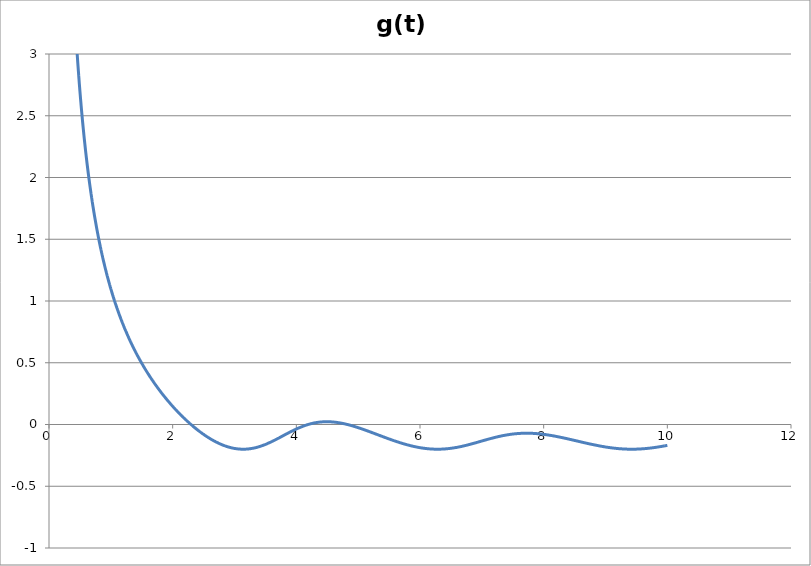
| Category | g(t)  |
|---|---|
| 0.01 | 149.798 |
| 0.02 | 74.796 |
| 0.03 | 49.794 |
| 0.04 | 37.292 |
| 0.05 | 29.79 |
| 0.06 | 24.788 |
| 0.07 | 21.215 |
| 0.08 | 18.534 |
| 0.09 | 16.449 |
| 0.1 | 14.78 |
| 0.11 | 13.414 |
| 0.12 | 12.276 |
| 0.13 | 11.312 |
| 0.14 | 10.486 |
| 0.15 | 9.77 |
| 0.16 | 9.143 |
| 0.17 | 8.59 |
| 0.18 | 8.097 |
| 0.19 | 7.657 |
| 0.2 | 7.26 |
| 0.21 | 6.901 |
| 0.22 | 6.574 |
| 0.23 | 6.276 |
| 0.24 | 6.002 |
| 0.25 | 5.75 |
| 0.26 | 5.517 |
| 0.27 | 5.302 |
| 0.28 | 5.101 |
| 0.29 | 4.914 |
| 0.3 | 4.74 |
| 0.31 | 4.577 |
| 0.32 | 4.423 |
| 0.33 | 4.279 |
| 0.34 | 4.144 |
| 0.35 | 4.016 |
| 0.36 | 3.895 |
| 0.37 | 3.78 |
| 0.38 | 3.671 |
| 0.39 | 3.568 |
| 0.4 | 3.47 |
| 0.41 | 3.376 |
| 0.42 | 3.287 |
| 0.43 | 3.202 |
| 0.44 | 3.121 |
| 0.45 | 3.043 |
| 0.46 | 2.969 |
| 0.47 | 2.897 |
| 0.48 | 2.829 |
| 0.49 | 2.763 |
| 0.5 | 2.7 |
| 0.51 | 2.639 |
| 0.52 | 2.58 |
| 0.53 | 2.524 |
| 0.54 | 2.469 |
| 0.55 | 2.417 |
| 0.56 | 2.366 |
| 0.57 | 2.317 |
| 0.58 | 2.27 |
| 0.59 | 2.224 |
| 0.6 | 2.18 |
| 0.61 | 2.137 |
| 0.62 | 2.095 |
| 0.63 | 2.055 |
| 0.64 | 2.015 |
| 0.65 | 1.977 |
| 0.66 | 1.94 |
| 0.67 | 1.904 |
| 0.68 | 1.869 |
| 0.69 | 1.835 |
| 0.7 | 1.802 |
| 0.71 | 1.77 |
| 0.72 | 1.739 |
| 0.73 | 1.708 |
| 0.74 | 1.678 |
| 0.75 | 1.649 |
| 0.76 | 1.621 |
| 0.77 | 1.593 |
| 0.78 | 1.566 |
| 0.79 | 1.54 |
| 0.8 | 1.514 |
| 0.81 | 1.489 |
| 0.82 | 1.464 |
| 0.83 | 1.44 |
| 0.84 | 1.417 |
| 0.85 | 1.394 |
| 0.86 | 1.371 |
| 0.87 | 1.349 |
| 0.88 | 1.327 |
| 0.89 | 1.306 |
| 0.9 | 1.285 |
| 0.91 | 1.265 |
| 0.92 | 1.245 |
| 0.93 | 1.226 |
| 0.94 | 1.206 |
| 0.95 | 1.188 |
| 0.96 | 1.169 |
| 0.97 | 1.151 |
| 0.98 | 1.133 |
| 0.99 | 1.116 |
| 1.0 | 1.098 |
| 1.01 | 1.081 |
| 1.02 | 1.065 |
| 1.03 | 1.049 |
| 1.04 | 1.033 |
| 1.05 | 1.017 |
| 1.06 | 1.001 |
| 1.07 | 0.986 |
| 1.08 | 0.971 |
| 1.09 | 0.956 |
| 1.1 | 0.942 |
| 1.11 | 0.927 |
| 1.12 | 0.913 |
| 1.13 | 0.899 |
| 1.14 | 0.886 |
| 1.15 | 0.872 |
| 1.16 | 0.859 |
| 1.17 | 0.846 |
| 1.18 | 0.833 |
| 1.19 | 0.82 |
| 1.2 | 0.807 |
| 1.21 | 0.795 |
| 1.22 | 0.783 |
| 1.23 | 0.771 |
| 1.24 | 0.759 |
| 1.25 | 0.747 |
| 1.26 | 0.736 |
| 1.27 | 0.724 |
| 1.28 | 0.713 |
| 1.29 | 0.702 |
| 1.3 | 0.691 |
| 1.31 | 0.68 |
| 1.32 | 0.669 |
| 1.33 | 0.659 |
| 1.34 | 0.648 |
| 1.35 | 0.638 |
| 1.36 | 0.628 |
| 1.37 | 0.618 |
| 1.38 | 0.608 |
| 1.39 | 0.598 |
| 1.4 | 0.588 |
| 1.41 | 0.578 |
| 1.42 | 0.569 |
| 1.43 | 0.559 |
| 1.44 | 0.55 |
| 1.45 | 0.541 |
| 1.46 | 0.532 |
| 1.47 | 0.523 |
| 1.48 | 0.514 |
| 1.49 | 0.505 |
| 1.5 | 0.496 |
| 1.51 | 0.487 |
| 1.52 | 0.479 |
| 1.53 | 0.47 |
| 1.54 | 0.462 |
| 1.55 | 0.454 |
| 1.56 | 0.445 |
| 1.57 | 0.437 |
| 1.58 | 0.429 |
| 1.59 | 0.421 |
| 1.6 | 0.413 |
| 1.61 | 0.405 |
| 1.62 | 0.398 |
| 1.63 | 0.39 |
| 1.64 | 0.382 |
| 1.65 | 0.375 |
| 1.66 | 0.367 |
| 1.67 | 0.36 |
| 1.68 | 0.353 |
| 1.69 | 0.345 |
| 1.7 | 0.338 |
| 1.71 | 0.331 |
| 1.72 | 0.324 |
| 1.73 | 0.317 |
| 1.74 | 0.31 |
| 1.75 | 0.303 |
| 1.76 | 0.296 |
| 1.77 | 0.289 |
| 1.78 | 0.282 |
| 1.79 | 0.276 |
| 1.8 | 0.269 |
| 1.81 | 0.263 |
| 1.82 | 0.256 |
| 1.83 | 0.25 |
| 1.84 | 0.243 |
| 1.85 | 0.237 |
| 1.86 | 0.231 |
| 1.87 | 0.224 |
| 1.88 | 0.218 |
| 1.89 | 0.212 |
| 1.9 | 0.206 |
| 1.91 | 0.2 |
| 1.92 | 0.194 |
| 1.93 | 0.188 |
| 1.94 | 0.182 |
| 1.95 | 0.176 |
| 1.96 | 0.17 |
| 1.97 | 0.165 |
| 1.98 | 0.159 |
| 1.99 | 0.153 |
| 2.0 | 0.148 |
| 2.01 | 0.142 |
| 2.02 | 0.137 |
| 2.03 | 0.131 |
| 2.04 | 0.126 |
| 2.05 | 0.12 |
| 2.06 | 0.115 |
| 2.07 | 0.11 |
| 2.08 | 0.104 |
| 2.09 | 0.099 |
| 2.1 | 0.094 |
| 2.11 | 0.089 |
| 2.12 | 0.084 |
| 2.13 | 0.079 |
| 2.14 | 0.074 |
| 2.15 | 0.069 |
| 2.16 | 0.064 |
| 2.17 | 0.059 |
| 2.18 | 0.054 |
| 2.19 | 0.049 |
| 2.2 | 0.044 |
| 2.21 | 0.04 |
| 2.22 | 0.035 |
| 2.23 | 0.03 |
| 2.24 | 0.026 |
| 2.25 | 0.021 |
| 2.26 | 0.017 |
| 2.27 | 0.012 |
| 2.28 | 0.008 |
| 2.29 | 0.003 |
| 2.3 | -0.001 |
| 2.31 | -0.006 |
| 2.32 | -0.01 |
| 2.33 | -0.014 |
| 2.34 | -0.018 |
| 2.35 | -0.022 |
| 2.36 | -0.027 |
| 2.37 | -0.031 |
| 2.38 | -0.035 |
| 2.39 | -0.039 |
| 2.4 | -0.043 |
| 2.41 | -0.046 |
| 2.42 | -0.05 |
| 2.43 | -0.054 |
| 2.44 | -0.058 |
| 2.45 | -0.062 |
| 2.46 | -0.065 |
| 2.47 | -0.069 |
| 2.48 | -0.073 |
| 2.49 | -0.076 |
| 2.5 | -0.08 |
| 2.51 | -0.083 |
| 2.52 | -0.087 |
| 2.53 | -0.09 |
| 2.54 | -0.093 |
| 2.55 | -0.097 |
| 2.56 | -0.1 |
| 2.57 | -0.103 |
| 2.58 | -0.106 |
| 2.59 | -0.11 |
| 2.6 | -0.113 |
| 2.61 | -0.116 |
| 2.62 | -0.119 |
| 2.63 | -0.122 |
| 2.64 | -0.124 |
| 2.65 | -0.127 |
| 2.66 | -0.13 |
| 2.67 | -0.133 |
| 2.68 | -0.136 |
| 2.69 | -0.138 |
| 2.7 | -0.141 |
| 2.71 | -0.143 |
| 2.72 | -0.146 |
| 2.73 | -0.148 |
| 2.74 | -0.151 |
| 2.75 | -0.153 |
| 2.76 | -0.155 |
| 2.77 | -0.158 |
| 2.78 | -0.16 |
| 2.79 | -0.162 |
| 2.8 | -0.164 |
| 2.81 | -0.166 |
| 2.82 | -0.168 |
| 2.83 | -0.17 |
| 2.84 | -0.172 |
| 2.85 | -0.174 |
| 2.86 | -0.175 |
| 2.87 | -0.177 |
| 2.88 | -0.179 |
| 2.89 | -0.18 |
| 2.9 | -0.182 |
| 2.91 | -0.183 |
| 2.92 | -0.185 |
| 2.93 | -0.186 |
| 2.94 | -0.187 |
| 2.95 | -0.188 |
| 2.96 | -0.19 |
| 2.97 | -0.191 |
| 2.98 | -0.192 |
| 2.99 | -0.193 |
| 3.0 | -0.194 |
| 3.01 | -0.195 |
| 3.02 | -0.195 |
| 3.03 | -0.196 |
| 3.04 | -0.197 |
| 3.05 | -0.197 |
| 3.06 | -0.198 |
| 3.07 | -0.198 |
| 3.08 | -0.199 |
| 3.09 | -0.199 |
| 3.1 | -0.199 |
| 3.11 | -0.2 |
| 3.12 | -0.2 |
| 3.13 | -0.2 |
| 3.14 | -0.2 |
| 3.15 | -0.2 |
| 3.16 | -0.2 |
| 3.17 | -0.2 |
| 3.18 | -0.2 |
| 3.19 | -0.199 |
| 3.2 | -0.199 |
| 3.21 | -0.199 |
| 3.22 | -0.198 |
| 3.23 | -0.198 |
| 3.24 | -0.197 |
| 3.25 | -0.196 |
| 3.26 | -0.196 |
| 3.27 | -0.195 |
| 3.28 | -0.194 |
| 3.29 | -0.193 |
| 3.3 | -0.192 |
| 3.31 | -0.191 |
| 3.32 | -0.19 |
| 3.33 | -0.189 |
| 3.34 | -0.188 |
| 3.35 | -0.186 |
| 3.36 | -0.185 |
| 3.37 | -0.184 |
| 3.38 | -0.182 |
| 3.39 | -0.181 |
| 3.4 | -0.179 |
| 3.41 | -0.178 |
| 3.42 | -0.176 |
| 3.43 | -0.174 |
| 3.44 | -0.173 |
| 3.45 | -0.171 |
| 3.46 | -0.169 |
| 3.47 | -0.167 |
| 3.48 | -0.165 |
| 3.49 | -0.163 |
| 3.5 | -0.161 |
| 3.51 | -0.159 |
| 3.52 | -0.157 |
| 3.53 | -0.155 |
| 3.54 | -0.153 |
| 3.55 | -0.15 |
| 3.56 | -0.148 |
| 3.57 | -0.146 |
| 3.58 | -0.144 |
| 3.59 | -0.141 |
| 3.6 | -0.139 |
| 3.61 | -0.136 |
| 3.62 | -0.134 |
| 3.63 | -0.132 |
| 3.64 | -0.129 |
| 3.65 | -0.127 |
| 3.66 | -0.124 |
| 3.67 | -0.121 |
| 3.68 | -0.119 |
| 3.69 | -0.116 |
| 3.7 | -0.114 |
| 3.71 | -0.111 |
| 3.72 | -0.108 |
| 3.73 | -0.106 |
| 3.74 | -0.103 |
| 3.75 | -0.1 |
| 3.76 | -0.098 |
| 3.77 | -0.095 |
| 3.78 | -0.092 |
| 3.79 | -0.09 |
| 3.8 | -0.087 |
| 3.81 | -0.084 |
| 3.82 | -0.082 |
| 3.83 | -0.079 |
| 3.84 | -0.076 |
| 3.85 | -0.074 |
| 3.86 | -0.071 |
| 3.87 | -0.069 |
| 3.88 | -0.066 |
| 3.89 | -0.063 |
| 3.9 | -0.061 |
| 3.91 | -0.058 |
| 3.92 | -0.056 |
| 3.93 | -0.053 |
| 3.94 | -0.051 |
| 3.95 | -0.048 |
| 3.96 | -0.046 |
| 3.97 | -0.044 |
| 3.98 | -0.041 |
| 3.99 | -0.039 |
| 4.0 | -0.037 |
| 4.01 | -0.034 |
| 4.02 | -0.032 |
| 4.03 | -0.03 |
| 4.04 | -0.028 |
| 4.05 | -0.026 |
| 4.06 | -0.023 |
| 4.07 | -0.021 |
| 4.08 | -0.019 |
| 4.09 | -0.017 |
| 4.1 | -0.016 |
| 4.11 | -0.014 |
| 4.12 | -0.012 |
| 4.13 | -0.01 |
| 4.14 | -0.008 |
| 4.15 | -0.007 |
| 4.16 | -0.005 |
| 4.17 | -0.003 |
| 4.18 | -0.002 |
| 4.19 | 0 |
| 4.2 | 0.001 |
| 4.21 | 0.003 |
| 4.22 | 0.004 |
| 4.23 | 0.005 |
| 4.24 | 0.007 |
| 4.25 | 0.008 |
| 4.26 | 0.009 |
| 4.27 | 0.01 |
| 4.28 | 0.011 |
| 4.29 | 0.012 |
| 4.3 | 0.013 |
| 4.31 | 0.014 |
| 4.32 | 0.015 |
| 4.33 | 0.016 |
| 4.34 | 0.017 |
| 4.35 | 0.018 |
| 4.36 | 0.018 |
| 4.37 | 0.019 |
| 4.38 | 0.019 |
| 4.39 | 0.02 |
| 4.4 | 0.02 |
| 4.41 | 0.021 |
| 4.42 | 0.021 |
| 4.43 | 0.022 |
| 4.44 | 0.022 |
| 4.45 | 0.022 |
| 4.46 | 0.022 |
| 4.47 | 0.022 |
| 4.48 | 0.023 |
| 4.49 | 0.023 |
| 4.5 | 0.023 |
| 4.51 | 0.022 |
| 4.52 | 0.022 |
| 4.53 | 0.022 |
| 4.54 | 0.022 |
| 4.55 | 0.022 |
| 4.56 | 0.022 |
| 4.57 | 0.021 |
| 4.58 | 0.021 |
| 4.59 | 0.02 |
| 4.6 | 0.02 |
| 4.61 | 0.019 |
| 4.62 | 0.019 |
| 4.63 | 0.018 |
| 4.64 | 0.018 |
| 4.65 | 0.017 |
| 4.66 | 0.016 |
| 4.67 | 0.016 |
| 4.68 | 0.015 |
| 4.69 | 0.014 |
| 4.7 | 0.013 |
| 4.71 | 0.012 |
| 4.72 | 0.012 |
| 4.73 | 0.011 |
| 4.74 | 0.01 |
| 4.75 | 0.009 |
| 4.76 | 0.008 |
| 4.77 | 0.006 |
| 4.78 | 0.005 |
| 4.79 | 0.004 |
| 4.8 | 0.003 |
| 4.81 | 0.002 |
| 4.82 | 0.001 |
| 4.83 | -0.001 |
| 4.84 | -0.002 |
| 4.85 | -0.003 |
| 4.86 | -0.005 |
| 4.87 | -0.006 |
| 4.88 | -0.007 |
| 4.89 | -0.009 |
| 4.9 | -0.01 |
| 4.91 | -0.012 |
| 4.92 | -0.013 |
| 4.93 | -0.015 |
| 4.94 | -0.016 |
| 4.95 | -0.018 |
| 4.96 | -0.019 |
| 4.97 | -0.021 |
| 4.98 | -0.022 |
| 4.99 | -0.024 |
| 5.0 | -0.026 |
| 5.01 | -0.027 |
| 5.02 | -0.029 |
| 5.03 | -0.031 |
| 5.04 | -0.032 |
| 5.05 | -0.034 |
| 5.06 | -0.036 |
| 5.07 | -0.037 |
| 5.08 | -0.039 |
| 5.09 | -0.041 |
| 5.1 | -0.043 |
| 5.11 | -0.045 |
| 5.12 | -0.046 |
| 5.13 | -0.048 |
| 5.14 | -0.05 |
| 5.15 | -0.052 |
| 5.16 | -0.054 |
| 5.17 | -0.055 |
| 5.18 | -0.057 |
| 5.19 | -0.059 |
| 5.2 | -0.061 |
| 5.21 | -0.063 |
| 5.22 | -0.065 |
| 5.23 | -0.067 |
| 5.24 | -0.068 |
| 5.25 | -0.07 |
| 5.26 | -0.072 |
| 5.27 | -0.074 |
| 5.28 | -0.076 |
| 5.29 | -0.078 |
| 5.3 | -0.08 |
| 5.31 | -0.082 |
| 5.32 | -0.084 |
| 5.33 | -0.085 |
| 5.34 | -0.087 |
| 5.35 | -0.089 |
| 5.36 | -0.091 |
| 5.37 | -0.093 |
| 5.38 | -0.095 |
| 5.39 | -0.097 |
| 5.4 | -0.099 |
| 5.41 | -0.1 |
| 5.42 | -0.102 |
| 5.43 | -0.104 |
| 5.44 | -0.106 |
| 5.45 | -0.108 |
| 5.46 | -0.11 |
| 5.47 | -0.112 |
| 5.48 | -0.113 |
| 5.49 | -0.115 |
| 5.5 | -0.117 |
| 5.51 | -0.119 |
| 5.52 | -0.121 |
| 5.53 | -0.122 |
| 5.54 | -0.124 |
| 5.55 | -0.126 |
| 5.56 | -0.128 |
| 5.57 | -0.129 |
| 5.58 | -0.131 |
| 5.59 | -0.133 |
| 5.6 | -0.135 |
| 5.61 | -0.136 |
| 5.62 | -0.138 |
| 5.63 | -0.14 |
| 5.64 | -0.141 |
| 5.65 | -0.143 |
| 5.66 | -0.144 |
| 5.67 | -0.146 |
| 5.68 | -0.148 |
| 5.69 | -0.149 |
| 5.7 | -0.151 |
| 5.71 | -0.152 |
| 5.72 | -0.154 |
| 5.73 | -0.155 |
| 5.74 | -0.157 |
| 5.75 | -0.158 |
| 5.76 | -0.16 |
| 5.77 | -0.161 |
| 5.78 | -0.163 |
| 5.79 | -0.164 |
| 5.8 | -0.165 |
| 5.81 | -0.167 |
| 5.82 | -0.168 |
| 5.83 | -0.169 |
| 5.84 | -0.17 |
| 5.85 | -0.172 |
| 5.86 | -0.173 |
| 5.87 | -0.174 |
| 5.88 | -0.175 |
| 5.89 | -0.176 |
| 5.9 | -0.178 |
| 5.91 | -0.179 |
| 5.92 | -0.18 |
| 5.93 | -0.181 |
| 5.94 | -0.182 |
| 5.95 | -0.183 |
| 5.96 | -0.184 |
| 5.97 | -0.185 |
| 5.98 | -0.186 |
| 5.99 | -0.187 |
| 6.0 | -0.188 |
| 6.01 | -0.188 |
| 6.02 | -0.189 |
| 6.03 | -0.19 |
| 6.04 | -0.191 |
| 6.05 | -0.191 |
| 6.06 | -0.192 |
| 6.07 | -0.193 |
| 6.08 | -0.194 |
| 6.09 | -0.194 |
| 6.1 | -0.195 |
| 6.11 | -0.195 |
| 6.12 | -0.196 |
| 6.13 | -0.196 |
| 6.14 | -0.197 |
| 6.15 | -0.197 |
| 6.16 | -0.198 |
| 6.17 | -0.198 |
| 6.18 | -0.198 |
| 6.19 | -0.199 |
| 6.2 | -0.199 |
| 6.21 | -0.199 |
| 6.22 | -0.199 |
| 6.23 | -0.2 |
| 6.24 | -0.2 |
| 6.25 | -0.2 |
| 6.26 | -0.2 |
| 6.27 | -0.2 |
| 6.28 | -0.2 |
| 6.29 | -0.2 |
| 6.3 | -0.2 |
| 6.31 | -0.2 |
| 6.32 | -0.2 |
| 6.33 | -0.2 |
| 6.34 | -0.199 |
| 6.35 | -0.199 |
| 6.36 | -0.199 |
| 6.37 | -0.199 |
| 6.38 | -0.199 |
| 6.39 | -0.198 |
| 6.4 | -0.198 |
| 6.41 | -0.197 |
| 6.42 | -0.197 |
| 6.43 | -0.197 |
| 6.44 | -0.196 |
| 6.45 | -0.196 |
| 6.46 | -0.195 |
| 6.47 | -0.195 |
| 6.48 | -0.194 |
| 6.49 | -0.193 |
| 6.5 | -0.193 |
| 6.51 | -0.192 |
| 6.52 | -0.191 |
| 6.53 | -0.191 |
| 6.54 | -0.19 |
| 6.55 | -0.189 |
| 6.56 | -0.188 |
| 6.57 | -0.187 |
| 6.58 | -0.186 |
| 6.59 | -0.186 |
| 6.6 | -0.185 |
| 6.61 | -0.184 |
| 6.62 | -0.183 |
| 6.63 | -0.182 |
| 6.64 | -0.181 |
| 6.65 | -0.18 |
| 6.66 | -0.179 |
| 6.67 | -0.177 |
| 6.68 | -0.176 |
| 6.69 | -0.175 |
| 6.7 | -0.174 |
| 6.71 | -0.173 |
| 6.72 | -0.172 |
| 6.73 | -0.171 |
| 6.74 | -0.169 |
| 6.75 | -0.168 |
| 6.76 | -0.167 |
| 6.77 | -0.166 |
| 6.78 | -0.164 |
| 6.79 | -0.163 |
| 6.8 | -0.162 |
| 6.81 | -0.16 |
| 6.82 | -0.159 |
| 6.83 | -0.158 |
| 6.84 | -0.156 |
| 6.85 | -0.155 |
| 6.86 | -0.154 |
| 6.87 | -0.152 |
| 6.88 | -0.151 |
| 6.89 | -0.149 |
| 6.9 | -0.148 |
| 6.91 | -0.147 |
| 6.92 | -0.145 |
| 6.93 | -0.144 |
| 6.94 | -0.142 |
| 6.95 | -0.141 |
| 6.96 | -0.139 |
| 6.97 | -0.138 |
| 6.98 | -0.137 |
| 6.99 | -0.135 |
| 7.0 | -0.134 |
| 7.01 | -0.132 |
| 7.02 | -0.131 |
| 7.03 | -0.129 |
| 7.04 | -0.128 |
| 7.05 | -0.127 |
| 7.06 | -0.125 |
| 7.07 | -0.124 |
| 7.08 | -0.122 |
| 7.09 | -0.121 |
| 7.1 | -0.119 |
| 7.11 | -0.118 |
| 7.12 | -0.117 |
| 7.13 | -0.115 |
| 7.14 | -0.114 |
| 7.15 | -0.113 |
| 7.16 | -0.111 |
| 7.17 | -0.11 |
| 7.18 | -0.109 |
| 7.19 | -0.107 |
| 7.2 | -0.106 |
| 7.21 | -0.105 |
| 7.22 | -0.104 |
| 7.23 | -0.103 |
| 7.24 | -0.101 |
| 7.25 | -0.1 |
| 7.26 | -0.099 |
| 7.27 | -0.098 |
| 7.28 | -0.097 |
| 7.29 | -0.096 |
| 7.3 | -0.094 |
| 7.31 | -0.093 |
| 7.32 | -0.092 |
| 7.33 | -0.091 |
| 7.34 | -0.09 |
| 7.35 | -0.089 |
| 7.36 | -0.088 |
| 7.37 | -0.087 |
| 7.38 | -0.086 |
| 7.39 | -0.086 |
| 7.4 | -0.085 |
| 7.41 | -0.084 |
| 7.42 | -0.083 |
| 7.43 | -0.082 |
| 7.44 | -0.081 |
| 7.45 | -0.081 |
| 7.46 | -0.08 |
| 7.47 | -0.079 |
| 7.48 | -0.079 |
| 7.49 | -0.078 |
| 7.5 | -0.077 |
| 7.51 | -0.077 |
| 7.52 | -0.076 |
| 7.53 | -0.076 |
| 7.54 | -0.075 |
| 7.55 | -0.075 |
| 7.56 | -0.074 |
| 7.57 | -0.074 |
| 7.58 | -0.073 |
| 7.59 | -0.073 |
| 7.6 | -0.073 |
| 7.61 | -0.072 |
| 7.62 | -0.072 |
| 7.63 | -0.072 |
| 7.64 | -0.072 |
| 7.65 | -0.071 |
| 7.66 | -0.071 |
| 7.67 | -0.071 |
| 7.68 | -0.071 |
| 7.69 | -0.071 |
| 7.7 | -0.071 |
| 7.71 | -0.071 |
| 7.72 | -0.071 |
| 7.73 | -0.071 |
| 7.74 | -0.071 |
| 7.75 | -0.071 |
| 7.76 | -0.071 |
| 7.77 | -0.071 |
| 7.78 | -0.071 |
| 7.79 | -0.071 |
| 7.8 | -0.071 |
| 7.81 | -0.071 |
| 7.82 | -0.072 |
| 7.83 | -0.072 |
| 7.84 | -0.072 |
| 7.85 | -0.073 |
| 7.86 | -0.073 |
| 7.87 | -0.073 |
| 7.88 | -0.074 |
| 7.89 | -0.074 |
| 7.9 | -0.074 |
| 7.91 | -0.075 |
| 7.92 | -0.075 |
| 7.93 | -0.076 |
| 7.94 | -0.076 |
| 7.95 | -0.077 |
| 7.96 | -0.077 |
| 7.97 | -0.078 |
| 7.98 | -0.079 |
| 7.99 | -0.079 |
| 8.0 | -0.08 |
| 8.01 | -0.08 |
| 8.02 | -0.081 |
| 8.03 | -0.082 |
| 8.04 | -0.083 |
| 8.05 | -0.083 |
| 8.06 | -0.084 |
| 8.07 | -0.085 |
| 8.08 | -0.086 |
| 8.09 | -0.086 |
| 8.1 | -0.087 |
| 8.11 | -0.088 |
| 8.12 | -0.089 |
| 8.13 | -0.09 |
| 8.14 | -0.091 |
| 8.15 | -0.091 |
| 8.16 | -0.092 |
| 8.17 | -0.093 |
| 8.18 | -0.094 |
| 8.19 | -0.095 |
| 8.2 | -0.096 |
| 8.21 | -0.097 |
| 8.22 | -0.098 |
| 8.23 | -0.099 |
| 8.24 | -0.1 |
| 8.25 | -0.101 |
| 8.26 | -0.102 |
| 8.27 | -0.103 |
| 8.28 | -0.104 |
| 8.29 | -0.105 |
| 8.3 | -0.106 |
| 8.31 | -0.107 |
| 8.32 | -0.108 |
| 8.33 | -0.11 |
| 8.34 | -0.111 |
| 8.35 | -0.112 |
| 8.36 | -0.113 |
| 8.37 | -0.114 |
| 8.38 | -0.115 |
| 8.39 | -0.116 |
| 8.4 | -0.117 |
| 8.41 | -0.119 |
| 8.42 | -0.12 |
| 8.43 | -0.121 |
| 8.44 | -0.122 |
| 8.45 | -0.123 |
| 8.46 | -0.124 |
| 8.47 | -0.125 |
| 8.48 | -0.127 |
| 8.49 | -0.128 |
| 8.5 | -0.129 |
| 8.51 | -0.13 |
| 8.52 | -0.131 |
| 8.53 | -0.133 |
| 8.54 | -0.134 |
| 8.55 | -0.135 |
| 8.56 | -0.136 |
| 8.57 | -0.137 |
| 8.58 | -0.138 |
| 8.59 | -0.14 |
| 8.6 | -0.141 |
| 8.61 | -0.142 |
| 8.62 | -0.143 |
| 8.63 | -0.144 |
| 8.64 | -0.145 |
| 8.65 | -0.147 |
| 8.66 | -0.148 |
| 8.67 | -0.149 |
| 8.68 | -0.15 |
| 8.69 | -0.151 |
| 8.7 | -0.152 |
| 8.71 | -0.153 |
| 8.72 | -0.154 |
| 8.73 | -0.156 |
| 8.74 | -0.157 |
| 8.75 | -0.158 |
| 8.76 | -0.159 |
| 8.77 | -0.16 |
| 8.78 | -0.161 |
| 8.79 | -0.162 |
| 8.8 | -0.163 |
| 8.81 | -0.164 |
| 8.82 | -0.165 |
| 8.83 | -0.166 |
| 8.84 | -0.167 |
| 8.85 | -0.168 |
| 8.86 | -0.169 |
| 8.87 | -0.17 |
| 8.88 | -0.171 |
| 8.89 | -0.172 |
| 8.9 | -0.173 |
| 8.91 | -0.174 |
| 8.92 | -0.175 |
| 8.93 | -0.176 |
| 8.94 | -0.177 |
| 8.95 | -0.178 |
| 8.96 | -0.179 |
| 8.97 | -0.179 |
| 8.98 | -0.18 |
| 8.99 | -0.181 |
| 9.0 | -0.182 |
| 9.01 | -0.183 |
| 9.02 | -0.183 |
| 9.03 | -0.184 |
| 9.04 | -0.185 |
| 9.05 | -0.186 |
| 9.06 | -0.186 |
| 9.07 | -0.187 |
| 9.08 | -0.188 |
| 9.09 | -0.189 |
| 9.1 | -0.189 |
| 9.11 | -0.19 |
| 9.12 | -0.19 |
| 9.13 | -0.191 |
| 9.14 | -0.192 |
| 9.15 | -0.192 |
| 9.16 | -0.193 |
| 9.17 | -0.193 |
| 9.18 | -0.194 |
| 9.19 | -0.194 |
| 9.2 | -0.195 |
| 9.21 | -0.195 |
| 9.22 | -0.196 |
| 9.23 | -0.196 |
| 9.24 | -0.196 |
| 9.25 | -0.197 |
| 9.26 | -0.197 |
| 9.27 | -0.197 |
| 9.28 | -0.198 |
| 9.29 | -0.198 |
| 9.3 | -0.198 |
| 9.31 | -0.199 |
| 9.32 | -0.199 |
| 9.33 | -0.199 |
| 9.34 | -0.199 |
| 9.35 | -0.199 |
| 9.36 | -0.2 |
| 9.37 | -0.2 |
| 9.38 | -0.2 |
| 9.39 | -0.2 |
| 9.4 | -0.2 |
| 9.41 | -0.2 |
| 9.42 | -0.2 |
| 9.43 | -0.2 |
| 9.44 | -0.2 |
| 9.45 | -0.2 |
| 9.46 | -0.2 |
| 9.47 | -0.2 |
| 9.48 | -0.2 |
| 9.49 | -0.2 |
| 9.5 | -0.199 |
| 9.51 | -0.199 |
| 9.52 | -0.199 |
| 9.53 | -0.199 |
| 9.54 | -0.199 |
| 9.55 | -0.198 |
| 9.56 | -0.198 |
| 9.57 | -0.198 |
| 9.58 | -0.197 |
| 9.59 | -0.197 |
| 9.6 | -0.197 |
| 9.61 | -0.196 |
| 9.62 | -0.196 |
| 9.63 | -0.196 |
| 9.64 | -0.195 |
| 9.65 | -0.195 |
| 9.66 | -0.194 |
| 9.67 | -0.194 |
| 9.68 | -0.193 |
| 9.69 | -0.193 |
| 9.7 | -0.192 |
| 9.71 | -0.192 |
| 9.72 | -0.191 |
| 9.73 | -0.19 |
| 9.74 | -0.19 |
| 9.75 | -0.189 |
| 9.76 | -0.189 |
| 9.77 | -0.188 |
| 9.78 | -0.187 |
| 9.79 | -0.187 |
| 9.8 | -0.186 |
| 9.81 | -0.185 |
| 9.82 | -0.184 |
| 9.83 | -0.184 |
| 9.84 | -0.183 |
| 9.85 | -0.182 |
| 9.86 | -0.181 |
| 9.87 | -0.18 |
| 9.88 | -0.18 |
| 9.89 | -0.179 |
| 9.9 | -0.178 |
| 9.91 | -0.177 |
| 9.92 | -0.176 |
| 9.93 | -0.175 |
| 9.94 | -0.174 |
| 9.95 | -0.174 |
| 9.96 | -0.173 |
| 9.97 | -0.172 |
| 9.98 | -0.171 |
| 9.99 | -0.17 |
| 10.0 | -0.169 |